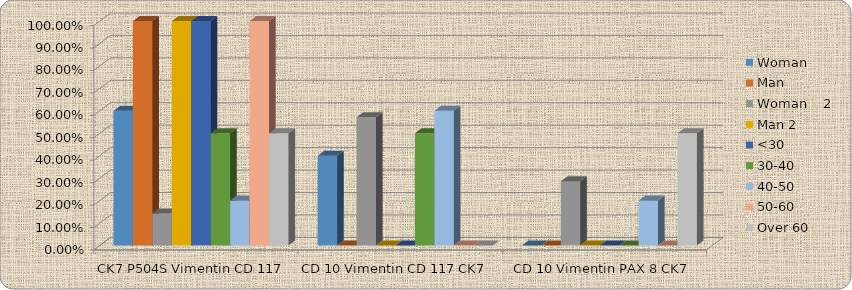
| Category | Woman     | Man  | Woman    2 | Man 2 | <30 | 30-40 | 40-50 | 50-60 | Over 60 |
|---|---|---|---|---|---|---|---|---|---|
| CK7 P504S Vimentin CD 117  | 0.6 | 1 | 0.143 | 1 | 1 | 0.5 | 0.2 | 1 | 0.5 |
| CD 10 Vimentin CD 117 CK7  | 0.4 | 0 | 0.571 | 0 | 0 | 0.5 | 0.6 | 0 | 0 |
| CD 10 Vimentin PAX 8 CK7 | 0 | 0 | 0.286 | 0 | 0 | 0 | 0.2 | 0 | 0.5 |